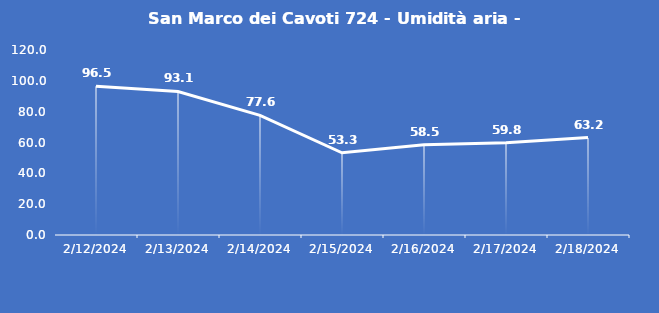
| Category | San Marco dei Cavoti 724 - Umidità aria - Grezzo (%) |
|---|---|
| 2/12/24 | 96.5 |
| 2/13/24 | 93.1 |
| 2/14/24 | 77.6 |
| 2/15/24 | 53.3 |
| 2/16/24 | 58.5 |
| 2/17/24 | 59.8 |
| 2/18/24 | 63.2 |